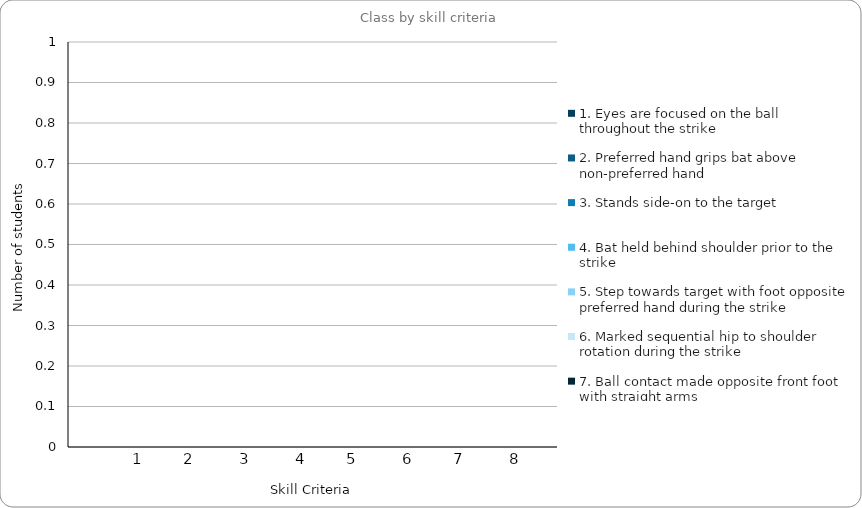
| Category | 1. Eyes are focused on the ball throughout the strike | 2. Preferred hand grips bat above non-preferred hand | 3. Stands side-on to the target | 4. Bat held behind shoulder prior to the strike | 5. Step towards target with foot opposite preferred hand during the strike | 6. Marked sequential hip to shoulder rotation during the strike | 7. Ball contact made opposite front foot with straight arms | 8. Follow through with bat around body |
|---|---|---|---|---|---|---|---|---|
| 0 | 0 | 0 | 0 | 0 | 0 | 0 | 0 | 0 |